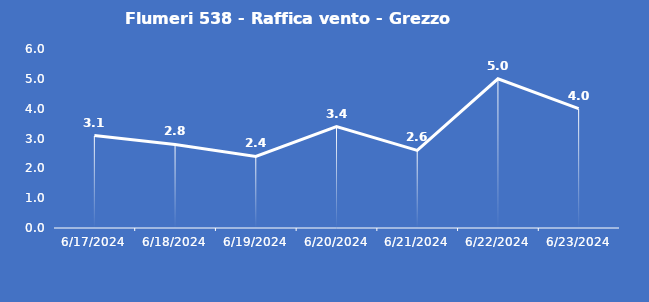
| Category | Flumeri 538 - Raffica vento - Grezzo (m/s) |
|---|---|
| 6/17/24 | 3.1 |
| 6/18/24 | 2.8 |
| 6/19/24 | 2.4 |
| 6/20/24 | 3.4 |
| 6/21/24 | 2.6 |
| 6/22/24 | 5 |
| 6/23/24 | 4 |